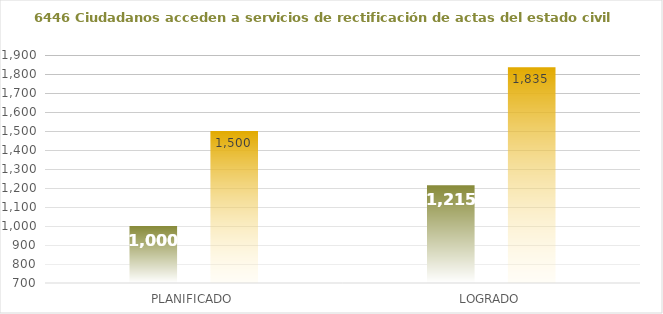
| Category | 6446 |
|---|---|
| PLANIFICADO | 1500 |
| LOGRADO | 1835 |